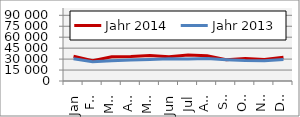
| Category | Jahr 2014 | Jahr 2013 |
|---|---|---|
| Jan | 33792.31 | 30510.496 |
| Feb | 27849.919 | 26327.662 |
| Mär | 33093.682 | 27862.056 |
| Apr | 33702.136 | 28897.058 |
| Mai | 34935.965 | 29532.824 |
| Jun | 33225.265 | 30427.016 |
| Jul | 35617.695 | 30029.262 |
| Aug | 34496.403 | 30675.781 |
| Sep | 29052.202 | 29142.771 |
| Okt | 30766.307 | 28115.989 |
| Nov | 29533.016 | 27732.531 |
| Dez | 32501.765 | 29287.333 |